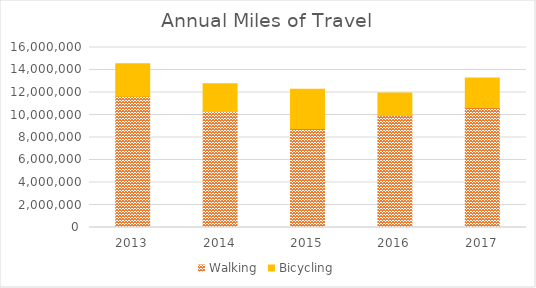
| Category | Walking | Bicycling |
|---|---|---|
| 2013 | 11677518.146 | 2870225.089 |
| 2014 | 10311553.907 | 2476471.271 |
| 2015 | 8803459.555 | 3479348.831 |
| 2016 | 9958123.937 | 1994181.479 |
| 2017 | 10668030.441 | 2626334.258 |